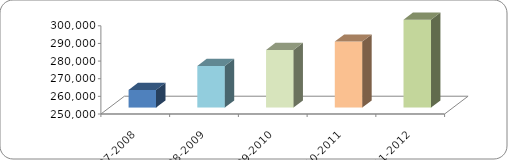
| Category | ALUMNO ATENDIDO (MATRÍCULA) |
|---|---|
| 2007-2008 | 260007 |
| 2008-2009 | 273602 |
| 2009-2010 | 282648 |
| 2010-2011 | 287379 |
| 2011-2012 | 299807 |